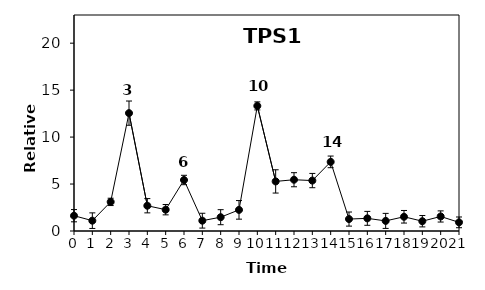
| Category | Series 0 |
|---|---|
| 0.0 | 1.63 |
| 1.0 | 1.1 |
| 2.0 | 3.1 |
| 3.0 | 12.55 |
| 4.0 | 2.69 |
| 5.0 | 2.27 |
| 6.0 | 5.43 |
| 7.0 | 1.1 |
| 8.0 | 1.47 |
| 9.0 | 2.25 |
| 10.0 | 13.32 |
| 11.0 | 5.28 |
| 12.0 | 5.46 |
| 13.0 | 5.37 |
| 14.0 | 7.36 |
| 15.0 | 1.27 |
| 16.0 | 1.347 |
| 17.0 | 1.075 |
| 18.0 | 1.516 |
| 19.0 | 1.042 |
| 20.0 | 1.548 |
| 21.0 | 0.92 |